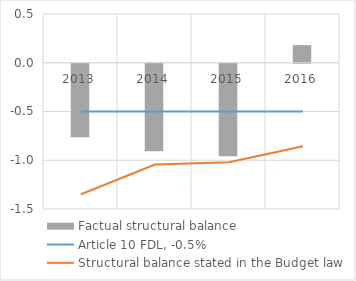
| Category | Factual structural balance |
|---|---|
| 2013.0 | -0.754 |
| 2014.0 | -0.897 |
| 2015.0 | -0.949 |
| 2016.0 | 0.181 |